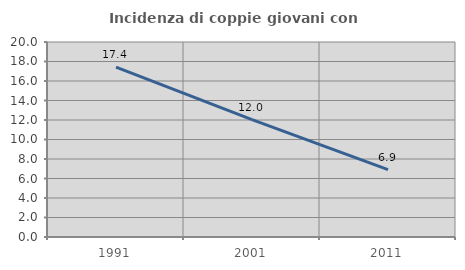
| Category | Incidenza di coppie giovani con figli |
|---|---|
| 1991.0 | 17.426 |
| 2001.0 | 12.031 |
| 2011.0 | 6.917 |